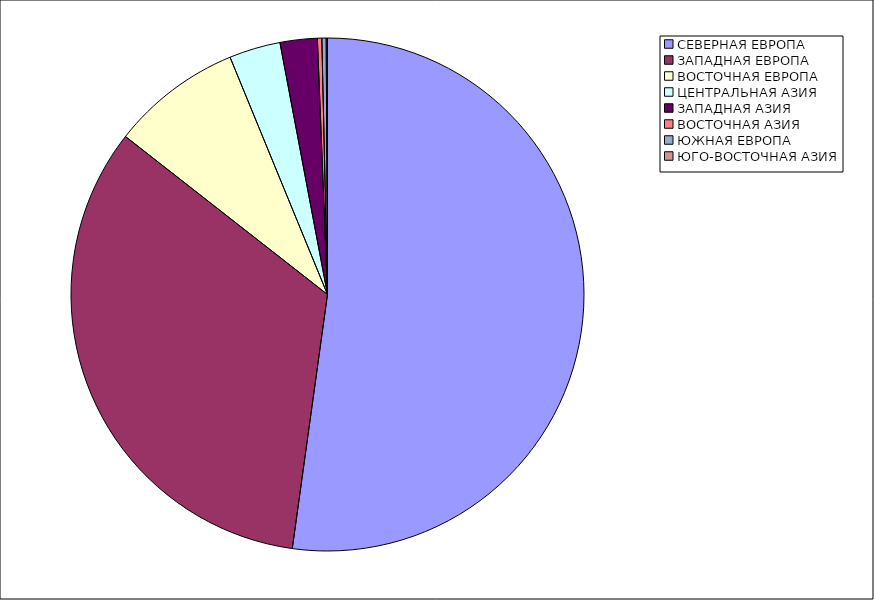
| Category | Оборот |
|---|---|
| СЕВЕРНАЯ ЕВРОПА | 52.193 |
| ЗАПАДНАЯ ЕВРОПА | 33.37 |
| ВОСТОЧНАЯ ЕВРОПА | 8.235 |
| ЦЕНТРАЛЬНАЯ АЗИЯ | 3.232 |
| ЗАПАДНАЯ АЗИЯ | 2.341 |
| ВОСТОЧНАЯ АЗИЯ | 0.277 |
| ЮЖНАЯ ЕВРОПА | 0.272 |
| ЮГО-ВОСТОЧНАЯ АЗИЯ | 0.08 |